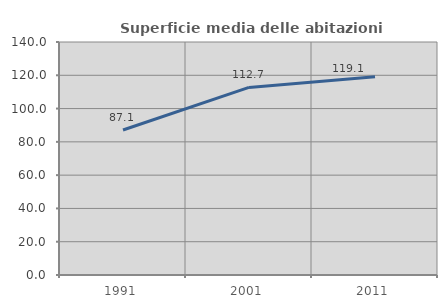
| Category | Superficie media delle abitazioni occupate |
|---|---|
| 1991.0 | 87.111 |
| 2001.0 | 112.708 |
| 2011.0 | 119.139 |